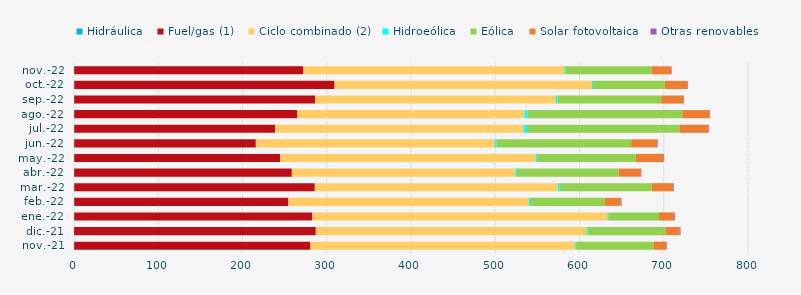
| Category | Hidráulica | Fuel/gas (1) | Ciclo combinado (2) | Hidroeólica | Eólica | Solar fotovoltaica | Otras renovables |
|---|---|---|---|---|---|---|---|
| nov.-21 | 0.231 | 280.35 | 314.276 | 1.14 | 91.769 | 15.037 | 0.753 |
| dic.-21 | 0.155 | 286.866 | 321.031 | 1.228 | 92.741 | 17.046 | 0.827 |
| ene.-22 | 0.294 | 282.53 | 350.332 | 1.111 | 60.126 | 18.057 | 0.861 |
| feb.-22 | 0.251 | 254.215 | 285.333 | 1.482 | 88.97 | 18.864 | 0.721 |
| mar.-22 | 0.296 | 285.515 | 288.521 | 2.126 | 109.415 | 25.048 | 0.91 |
| abr.-22 | 0.274 | 258.292 | 265.373 | 1.753 | 120.739 | 26.389 | 0.614 |
| may.-22 | 0.299 | 244.426 | 303.457 | 1.917 | 116.774 | 32.867 | 0.721 |
| jun.-22 | 0.281 | 215.547 | 283.584 | 2.45 | 159.505 | 30.724 | 0.696 |
| jul.-22 | 0.294 | 238.317 | 295.517 | 3.563 | 180.965 | 34.259 | 0.688 |
| ago.-22 | 0.293 | 264.803 | 269.791 | 3.518 | 183.708 | 32.217 | 0.715 |
| sep.-22 | 0.289 | 286.046 | 285.298 | 2.075 | 123.261 | 26.44 | 0.715 |
| oct.-22 | 0.294 | 308.951 | 305.386 | 1.35 | 85.114 | 26.618 | 0.731 |
| nov.-22 | 0.277 | 271.883 | 309.743 | 1.169 | 102.432 | 23.049 | 0.765 |